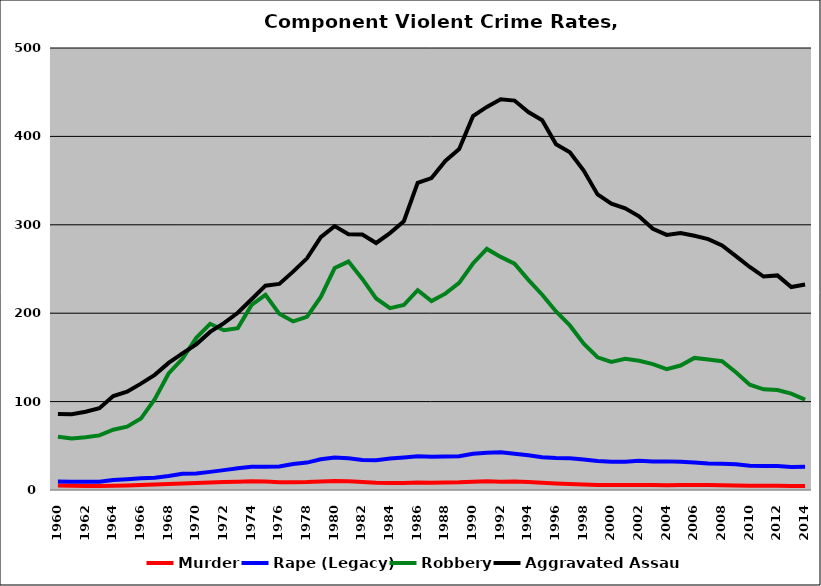
| Category | Murder | Rape (Legacy) | Robbery | Aggravated Assault |
|---|---|---|---|---|
| 1960.0 | 5.08 | 9.586 | 60.137 | 86.057 |
| 1961.0 | 4.776 | 9.41 | 58.292 | 85.665 |
| 1962.0 | 4.592 | 9.447 | 59.676 | 88.588 |
| 1963.0 | 4.584 | 9.364 | 61.793 | 92.427 |
| 1964.0 | 4.897 | 11.206 | 68.217 | 106.23 |
| 1965.0 | 5.147 | 12.097 | 71.665 | 111.267 |
| 1966.0 | 5.645 | 13.202 | 80.782 | 120.327 |
| 1967.0 | 6.199 | 13.988 | 102.762 | 130.236 |
| 1968.0 | 6.921 | 15.883 | 131.816 | 143.782 |
| 1969.0 | 7.329 | 18.457 | 148.397 | 154.475 |
| 1970.0 | 7.873 | 18.693 | 172.145 | 164.819 |
| 1971.0 | 8.622 | 20.493 | 188.01 | 178.826 |
| 1972.0 | 8.966 | 22.499 | 180.709 | 188.777 |
| 1973.0 | 9.359 | 24.494 | 183.092 | 200.452 |
| 1974.0 | 9.797 | 26.207 | 209.279 | 215.812 |
| 1975.0 | 9.624 | 26.318 | 220.763 | 231.142 |
| 1976.0 | 8.749 | 26.591 | 199.297 | 233.174 |
| 1977.0 | 8.838 | 29.353 | 190.73 | 247.005 |
| 1978.0 | 8.97 | 31.005 | 195.786 | 262.067 |
| 1979.0 | 9.75 | 34.707 | 218.402 | 285.999 |
| 1980.0 | 10.224 | 36.827 | 251.095 | 298.492 |
| 1981.0 | 9.814 | 35.953 | 258.387 | 289.324 |
| 1982.0 | 9.069 | 34.002 | 238.763 | 288.987 |
| 1983.0 | 8.259 | 33.756 | 216.674 | 279.434 |
| 1984.0 | 7.926 | 35.718 | 205.664 | 290.618 |
| 1985.0 | 7.976 | 36.848 | 209.258 | 303.982 |
| 1986.0 | 8.584 | 38.087 | 226.031 | 347.442 |
| 1987.0 | 8.294 | 37.604 | 213.672 | 352.921 |
| 1988.0 | 8.456 | 37.827 | 222.074 | 372.227 |
| 1989.0 | 8.711 | 38.289 | 234.312 | 385.589 |
| 1990.0 | 9.395 | 41.11 | 256.257 | 422.851 |
| 1991.0 | 9.797 | 42.273 | 272.744 | 433.363 |
| 1992.0 | 9.317 | 42.764 | 263.686 | 441.899 |
| 1993.0 | 9.514 | 41.125 | 255.979 | 440.529 |
| 1994.0 | 8.96 | 39.264 | 237.758 | 427.608 |
| 1995.0 | 8.221 | 37.089 | 220.891 | 418.262 |
| 1996.0 | 7.407 | 36.29 | 201.937 | 391.002 |
| 1997.0 | 6.8 | 35.907 | 186.17 | 382.1 |
| 1998.0 | 6.281 | 34.466 | 165.472 | 361.365 |
| 1999.0 | 5.692 | 32.788 | 150.123 | 334.349 |
| 2000.0 | 5.538 | 32.044 | 144.984 | 323.964 |
| 2001.0 | 5.621 | 31.846 | 148.451 | 318.6 |
| 2002.0 | 5.636 | 33.071 | 146.126 | 309.544 |
| 2003.0 | 5.684 | 32.286 | 142.452 | 295.414 |
| 2004.0 | 5.499 | 32.381 | 136.714 | 288.562 |
| 2005.0 | 5.646 | 31.819 | 140.785 | 290.792 |
| 2006.0 | 5.688 | 30.981 | 149.434 | 287.528 |
| 2007.0 | 5.613 | 29.98 | 147.578 | 283.752 |
| 2008.0 | 5.402 | 29.726 | 145.733 | 276.677 |
| 2009.0 | 5.016 | 29.068 | 133.138 | 264.657 |
| 2010.0 | 4.777 | 27.455 | 119.138 | 252.279 |
| 2011.0 | 4.705 | 27.015 | 113.859 | 241.48 |
| 2012.0 | 4.736 | 27.126 | 113.119 | 242.776 |
| 2013.0 | 4.524 | 25.943 | 109.036 | 229.567 |
| 2014.0 | 4.469 | 26.357 | 102.178 | 232.484 |